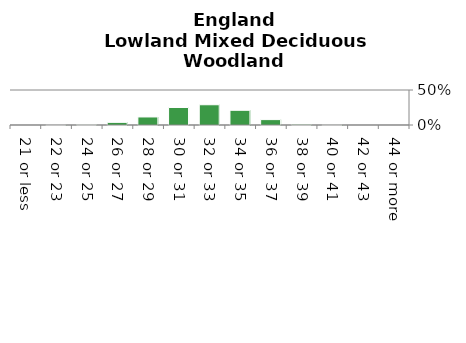
| Category | Lowland Mixed Deciduous Woodland |
|---|---|
| 21 or less | 0 |
| 22 or 23 | 0 |
| 24 or 25 | 0.009 |
| 26 or 27 | 0.038 |
| 28 or 29 | 0.115 |
| 30 or 31 | 0.25 |
| 32 or 33 | 0.289 |
| 34 or 35 | 0.21 |
| 36 or 37 | 0.077 |
| 38 or 39 | 0.011 |
| 40 or 41 | 0.001 |
| 42 or 43 | 0 |
| 44 or more | 0 |